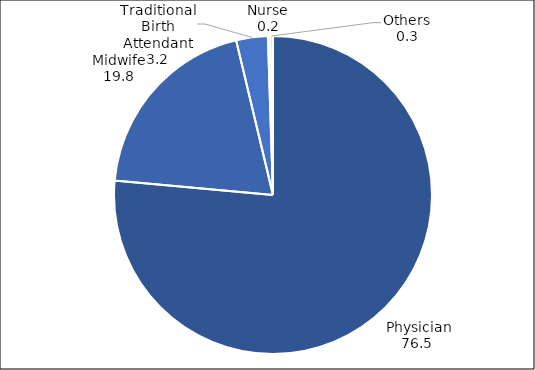
| Category | Series 0 |
|---|---|
| Physician | 76.454 |
| Midwife | 19.819 |
| Traditional Birth Attendant | 3.212 |
| Nurse | 0.24 |
| Others | 0.274 |